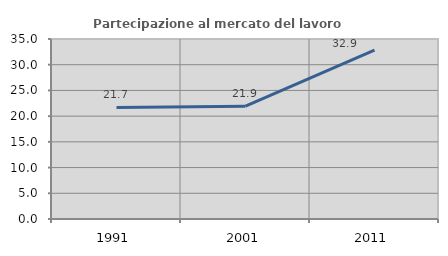
| Category | Partecipazione al mercato del lavoro  femminile |
|---|---|
| 1991.0 | 21.701 |
| 2001.0 | 21.935 |
| 2011.0 | 32.857 |